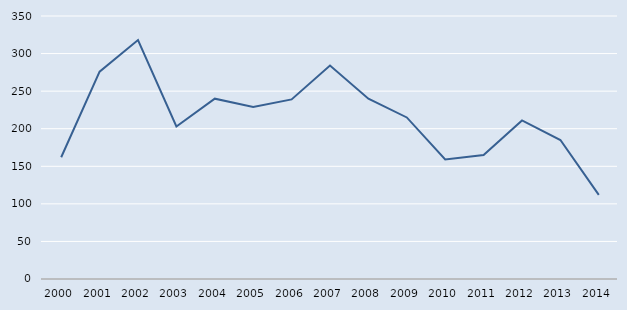
| Category | Series 0 |
|---|---|
| 2000.0 | 162 |
| 2001.0 | 276 |
| 2002.0 | 318 |
| 2003.0 | 203 |
| 2004.0 | 240 |
| 2005.0 | 229 |
| 2006.0 | 239 |
| 2007.0 | 284 |
| 2008.0 | 240 |
| 2009.0 | 215 |
| 2010.0 | 159 |
| 2011.0 | 165 |
| 2012.0 | 211 |
| 2013.0 | 185 |
| 2014.0 | 112 |